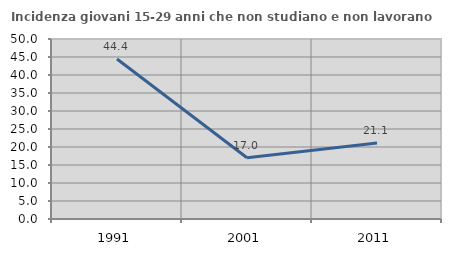
| Category | Incidenza giovani 15-29 anni che non studiano e non lavorano  |
|---|---|
| 1991.0 | 44.444 |
| 2001.0 | 17.015 |
| 2011.0 | 21.131 |